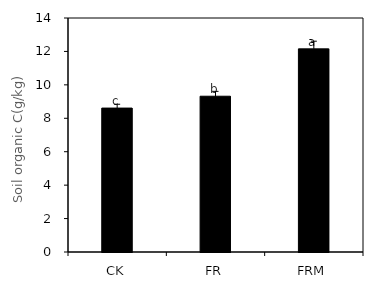
| Category | Soil organic C(g/kg) |
|---|---|
| CK | 8.61 |
| FR | 9.32 |
| FRM | 12.153 |